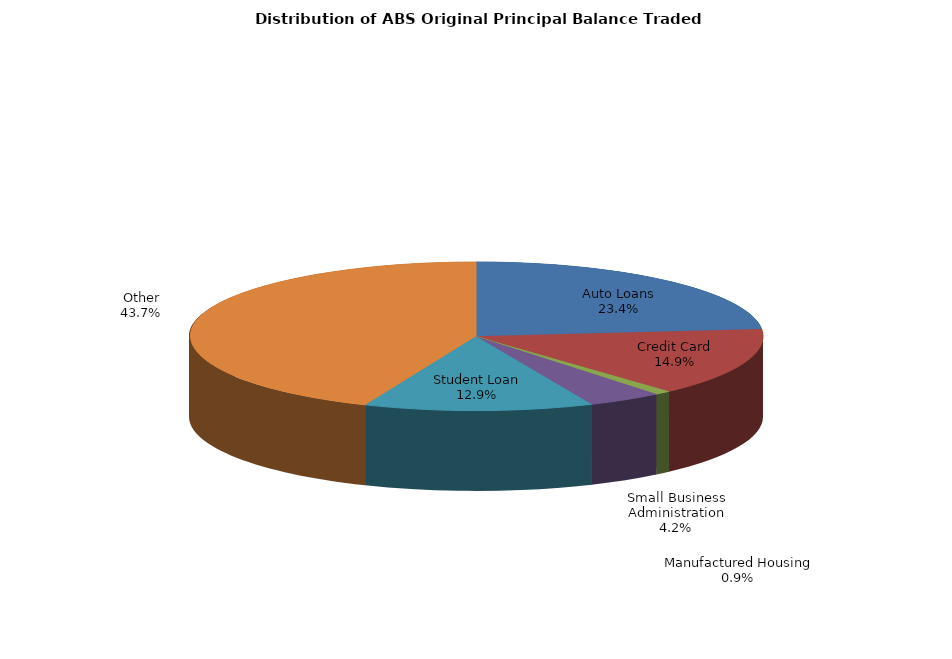
| Category | Series 0 |
|---|---|
| Auto Loans | 588185005.332 |
| Credit Card | 373033974.474 |
| Manufactured Housing | 23066728.9 |
| Small Business Administration | 105581696.112 |
| Student Loan | 323998703.1 |
| Other | 1097531660.48 |